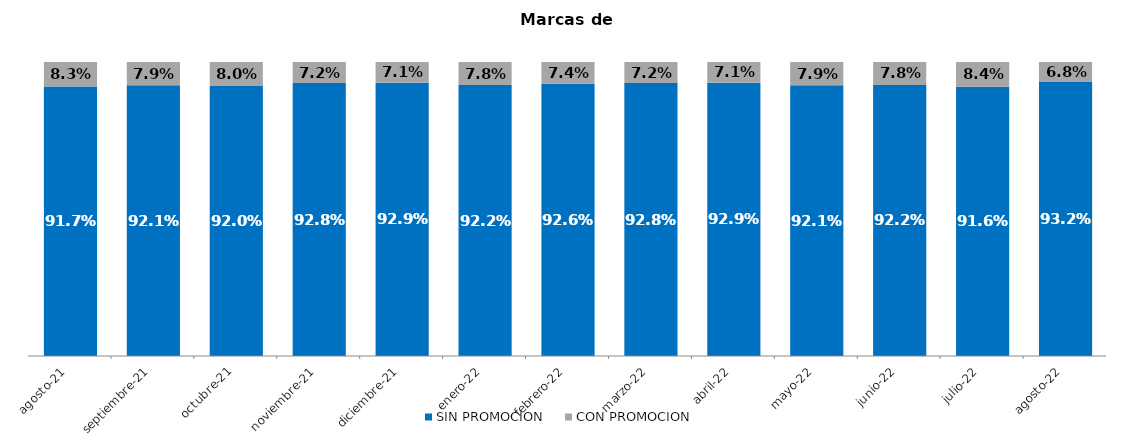
| Category | SIN PROMOCION   | CON PROMOCION   |
|---|---|---|
| 2021-08-01 | 0.917 | 0.083 |
| 2021-09-01 | 0.921 | 0.079 |
| 2021-10-01 | 0.92 | 0.08 |
| 2021-11-01 | 0.928 | 0.072 |
| 2021-12-01 | 0.929 | 0.071 |
| 2022-01-01 | 0.922 | 0.078 |
| 2022-02-01 | 0.926 | 0.074 |
| 2022-03-01 | 0.928 | 0.072 |
| 2022-04-01 | 0.929 | 0.071 |
| 2022-05-01 | 0.921 | 0.079 |
| 2022-06-01 | 0.922 | 0.078 |
| 2022-07-01 | 0.916 | 0.084 |
| 2022-08-01 | 0.932 | 0.068 |